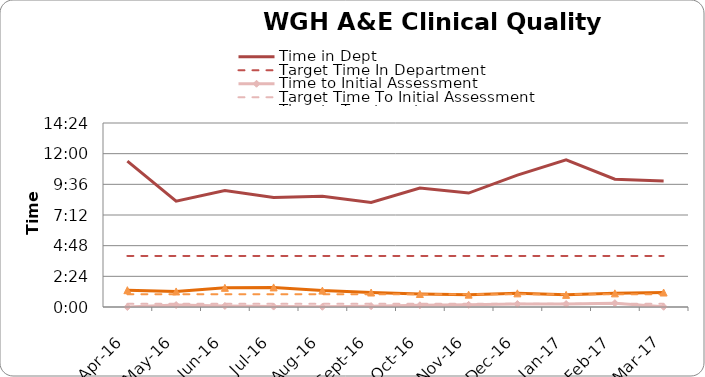
| Category | Time in Dept | Target Time In Department | Time to Initial Assessment | Target Time To Initial Assessment | Time to Treatment | Target Time To Treatment |
|---|---|---|---|---|---|---|
| 2016-04-01 | 0.476 | 0.167 | 0 | 0.01 | 0.055 | 0.042 |
| 2016-05-01 | 0.345 | 0.167 | 0.006 | 0.01 | 0.051 | 0.042 |
| 2016-06-01 | 0.38 | 0.167 | 0.003 | 0.01 | 0.062 | 0.042 |
| 2016-07-01 | 0.357 | 0.167 | 0.001 | 0.01 | 0.064 | 0.042 |
| 2016-08-01 | 0.361 | 0.167 | 0.001 | 0.01 | 0.053 | 0.042 |
| 2016-09-01 | 0.341 | 0.167 | 0.003 | 0.01 | 0.047 | 0.042 |
| 2016-10-01 | 0.388 | 0.167 | 0.006 | 0.01 | 0.042 | 0.042 |
| 2016-11-01 | 0.372 | 0.167 | 0.007 | 0.01 | 0.04 | 0.042 |
| 2016-12-01 | 0.43 | 0.167 | 0.01 | 0.01 | 0.044 | 0.042 |
| 2017-01-01 | 0.48 | 0.167 | 0.01 | 0.01 | 0.04 | 0.042 |
| 2017-02-01 | 0.417 | 0.167 | 0.012 | 0.01 | 0.044 | 0.042 |
| 2017-03-01 | 0.411 | 0.167 | 0.001 | 0.01 | 0.047 | 0.042 |